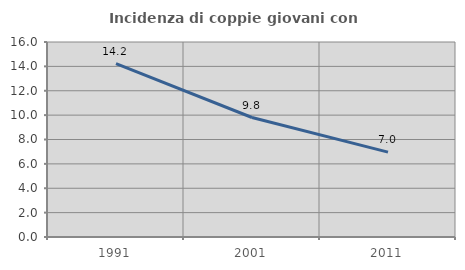
| Category | Incidenza di coppie giovani con figli |
|---|---|
| 1991.0 | 14.219 |
| 2001.0 | 9.804 |
| 2011.0 | 6.967 |